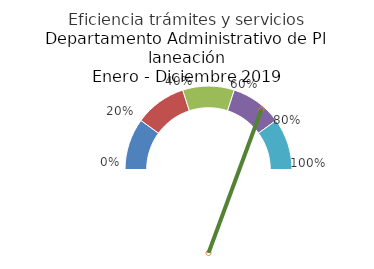
| Category | 2.25801972 |
|---|---|
| 0.0 | 0.2 |
| 0.2 | 0.2 |
| 0.4 | 0.2 |
| 0.6 | 0.2 |
| 0.8 | 0.2 |
| 1.0 | 1 |